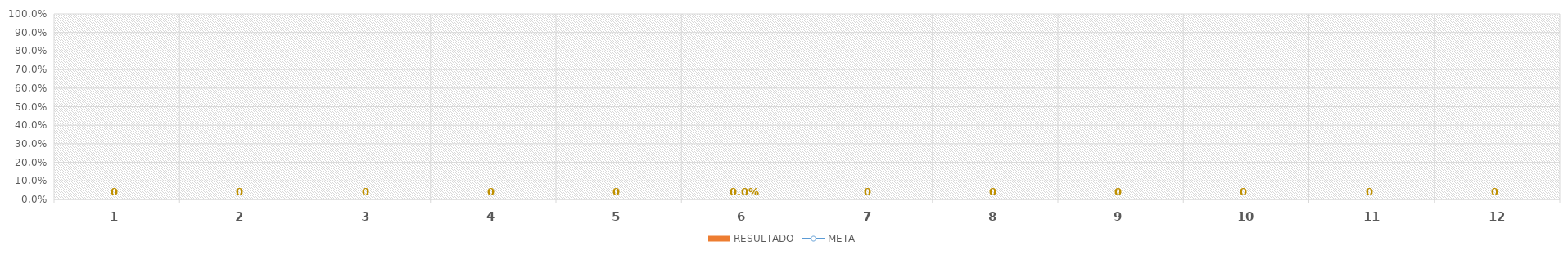
| Category | RESULTADO |
|---|---|
| 0 | 0 |
| 1 | 0 |
| 2 | 0 |
| 3 | 0 |
| 4 | 0 |
| 5 | 0 |
| 6 | 0 |
| 7 | 0 |
| 8 | 0 |
| 9 | 0 |
| 10 | 0 |
| 11 | 0 |